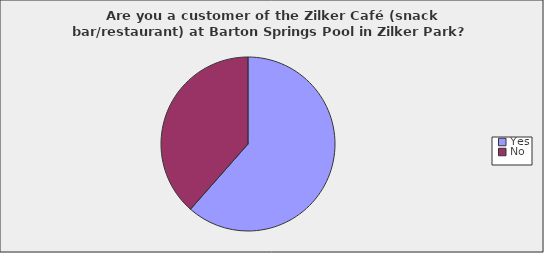
| Category | Series 0 |
|---|---|
| Yes | 0.615 |
| No | 0.385 |